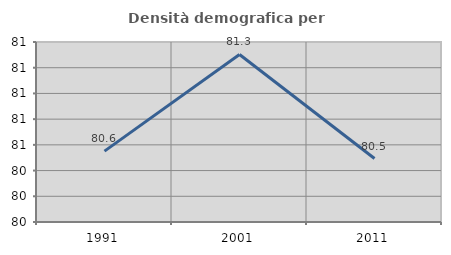
| Category | Densità demografica |
|---|---|
| 1991.0 | 80.551 |
| 2001.0 | 81.303 |
| 2011.0 | 80.494 |